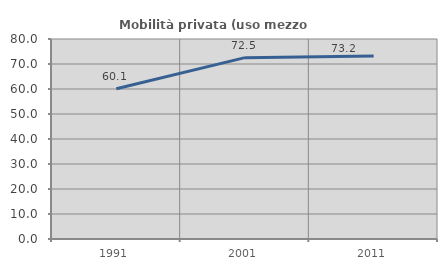
| Category | Mobilità privata (uso mezzo privato) |
|---|---|
| 1991.0 | 60.089 |
| 2001.0 | 72.539 |
| 2011.0 | 73.22 |